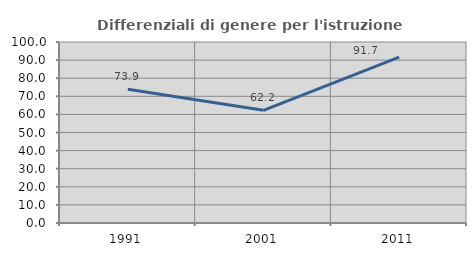
| Category | Differenziali di genere per l'istruzione superiore |
|---|---|
| 1991.0 | 73.919 |
| 2001.0 | 62.244 |
| 2011.0 | 91.661 |